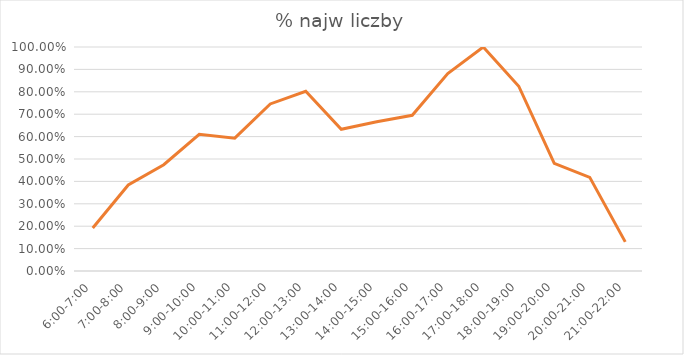
| Category | % najw liczby |
|---|---|
| 6:00-7:00 | 0.192 |
| 7:00-8:00 | 0.384 |
| 8:00-9:00 | 0.475 |
| 9:00-10:00 | 0.61 |
| 10:00-11:00 | 0.593 |
| 11:00-12:00 | 0.746 |
| 12:00-13:00 | 0.802 |
| 13:00-14:00 | 0.633 |
| 14:00-15:00 | 0.667 |
| 15:00-16:00 | 0.695 |
| 16:00-17:00 | 0.881 |
| 17:00-18:00 | 1 |
| 18:00-19:00 | 0.825 |
| 19:00-20:00 | 0.48 |
| 20:00-21:00 | 0.418 |
| 21:00-22:00 | 0.13 |